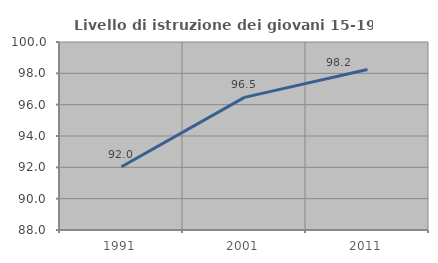
| Category | Livello di istruzione dei giovani 15-19 anni |
|---|---|
| 1991.0 | 92.038 |
| 2001.0 | 96.464 |
| 2011.0 | 98.249 |